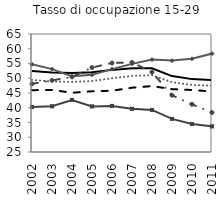
| Category | EU 25 | EU 15 | Germania | Spagna | Francia | Italia |
|---|---|---|---|---|---|---|
| 2002.0 | 49.437 | 52.48 | 54.715 | 48.095 | 45.957 | 40.281 |
| 2003.0 | 48.899 | 51.909 | 53.085 | 49.27 | 46.048 | 40.502 |
| 2004.0 | 48.766 | 51.788 | 50.643 | 50.462 | 45.072 | 42.652 |
| 2005.0 | 49.057 | 52.039 | 51.15 | 53.63 | 45.59 | 40.454 |
| 2006.0 | 49.985 | 52.838 | 53.09 | 55.162 | 45.766 | 40.618 |
| 2007.0 | 50.794 | 53.408 | 54.869 | 55.38 | 46.799 | 39.643 |
| 2008.0 | 51.018 | 53.357 | 56.319 | 52.069 | 47.349 | 39.252 |
| 2009.0 | 48.662 | 50.728 | 55.981 | 44.239 | 46.299 | 36.231 |
| 2010.0 | 47.735 | 49.705 | 56.592 | 41.17 | 46.021 | 34.48 |
| 2011.0 | 47.481 | 49.352 | 58.345 | 38.381 | 45.519 | 33.696 |